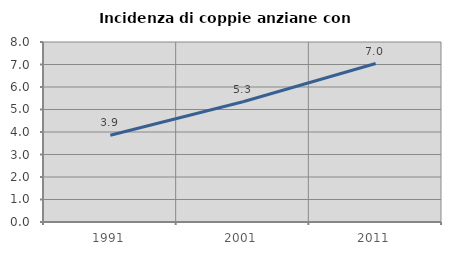
| Category | Incidenza di coppie anziane con figli |
|---|---|
| 1991.0 | 3.859 |
| 2001.0 | 5.346 |
| 2011.0 | 7.042 |